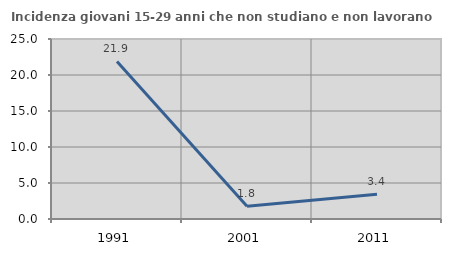
| Category | Incidenza giovani 15-29 anni che non studiano e non lavorano  |
|---|---|
| 1991.0 | 21.888 |
| 2001.0 | 1.786 |
| 2011.0 | 3.448 |